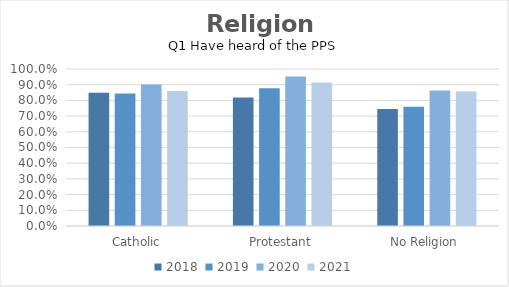
| Category | 2018 | 2019 | 2020 | 2021 |
|---|---|---|---|---|
| Catholic | 0.849 | 0.844 | 0.901 | 0.86 |
| Protestant | 0.818 | 0.877 | 0.952 | 0.913 |
| No Religion | 0.745 | 0.759 | 0.863 | 0.856 |